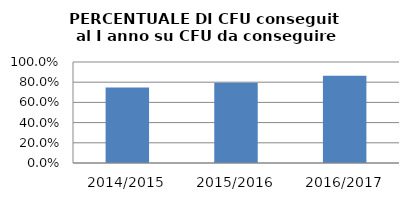
| Category | 2014/2015 2015/2016 2016/2017 |
|---|---|
| 2014/2015 | 0.746 |
| 2015/2016 | 0.794 |
| 2016/2017 | 0.863 |